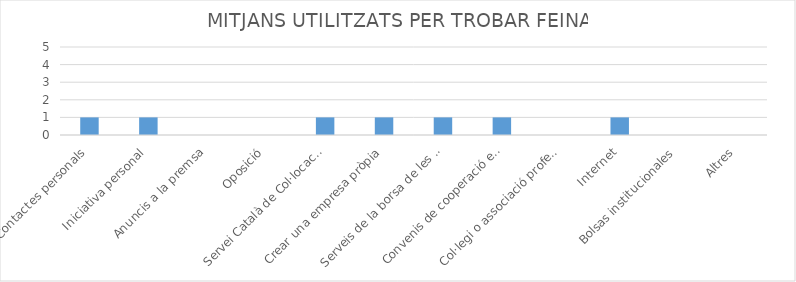
| Category | Series 0 |
|---|---|
| Contactes personals | 1 |
| Iniciativa personal | 1 |
| Anuncis a la premsa | 0 |
| Oposició | 0 |
| Servei Català de Col·locació | 1 |
| Crear una empresa pròpia | 1 |
| Serveis de la borsa de les universitats | 1 |
| Convenis de cooperació educativa | 1 |
| Col·legi o associació professional | 0 |
| Internet | 1 |
| Bolsas institucionales | 0 |
| Altres | 0 |